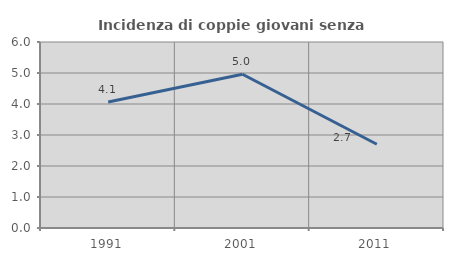
| Category | Incidenza di coppie giovani senza figli |
|---|---|
| 1991.0 | 4.065 |
| 2001.0 | 4.959 |
| 2011.0 | 2.703 |